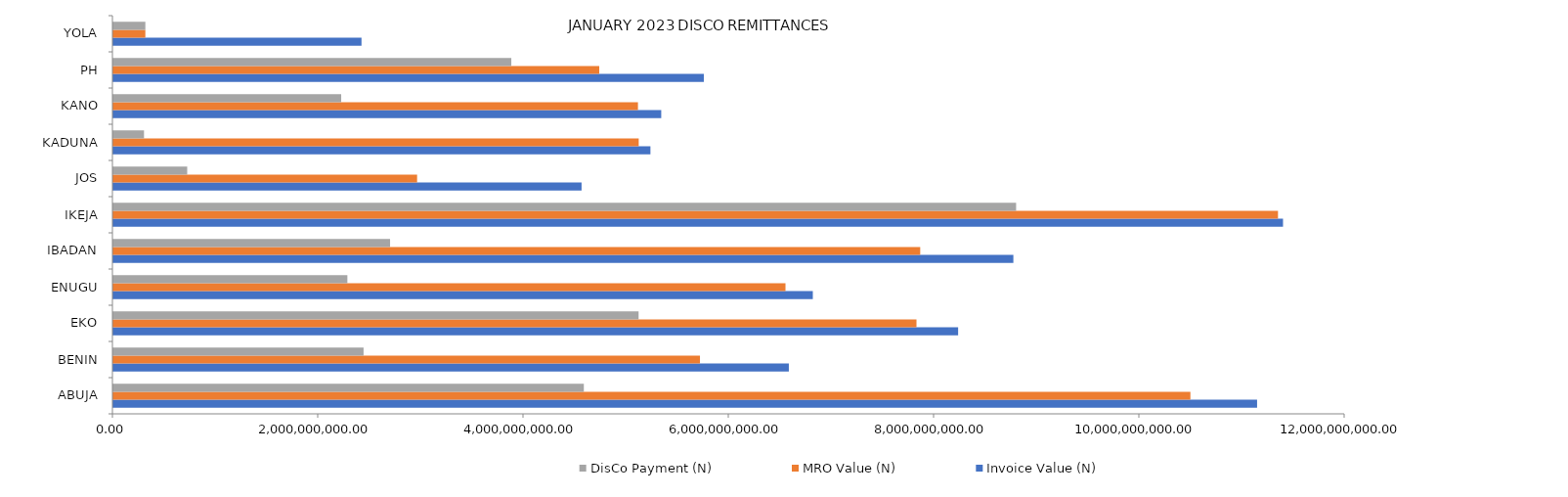
| Category | Invoice Value (N) | MRO Value (N) | DisCo Payment (N) |
|---|---|---|---|
| ABUJA | 11142351296.336 | 10492752215.76 | 4583227725.63 |
| BENIN | 6580522776.395 | 5714525979.021 | 2437093450.89 |
| EKO | 8229717546.498 | 7823992471.456 | 5116701354.73 |
| ENUGU | 6814187085.076 | 6547752370.05 | 2279600264.1 |
| IBADAN | 8767861362.333 | 7860387711.332 | 2695490158.85 |
| IKEJA | 11395076688.41 | 11346077858.65 | 8794690896.04 |
| JOS | 4561120465.673 | 2958798846.082 | 719059963.62 |
| KADUNA | 5232056605.543 | 5117997771.543 | 298221577.97 |
| KANO | 5337292095.713 | 5110457181.645 | 2219332758.71 |
| PH | 5752253819.497 | 4733529668.064 | 3876657988.74 |
| YOLA | 2417119043.259 | 311324932.772 | 311324932.77 |